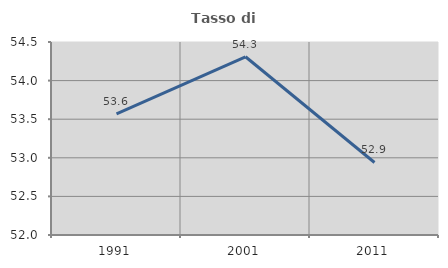
| Category | Tasso di occupazione   |
|---|---|
| 1991.0 | 53.569 |
| 2001.0 | 54.309 |
| 2011.0 | 52.94 |